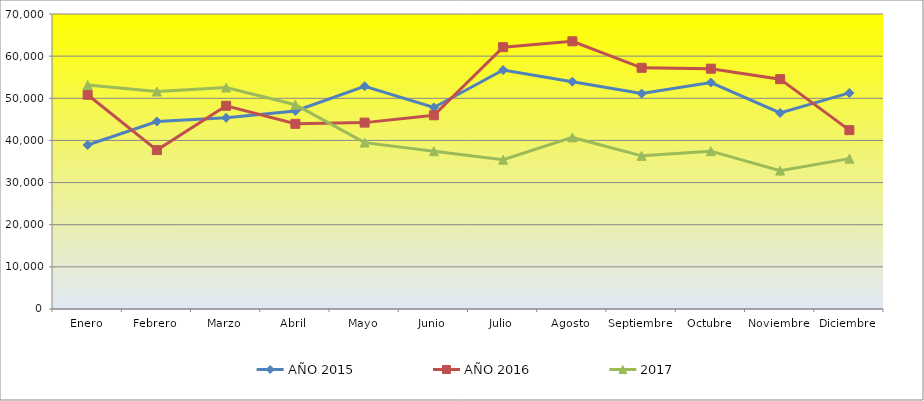
| Category | AÑO 2015 | AÑO 2016 | 2017 |
|---|---|---|---|
| Enero | 38920 | 50830 | 53150 |
| Febrero | 44500 | 37710 | 51600 |
| Marzo | 45360 | 48220 | 52550 |
| Abril | 47000 | 43940 | 48480 |
| Mayo | 52840 | 44225 | 39479.571 |
| Junio | 47820 | 45970 | 37422.489 |
| Julio | 56700 | 62130 | 35425.322 |
| Agosto | 53940 | 63520 | 40712.103 |
| Septiembre | 51120 | 57230 | 36337.94 |
| Octubre | 53740 | 57020 | 37452.195 |
| Noviembre | 46530 | 54540 | 32836.098 |
| Diciembre | 51280 | 42440 | 35681.459 |